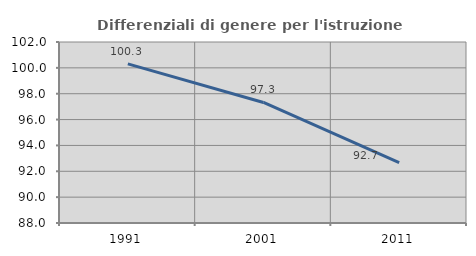
| Category | Differenziali di genere per l'istruzione superiore |
|---|---|
| 1991.0 | 100.31 |
| 2001.0 | 97.321 |
| 2011.0 | 92.671 |